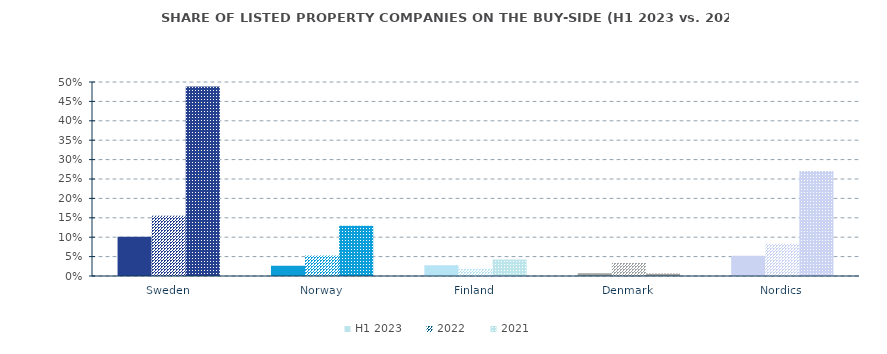
| Category | H1 2023 | 2022 | 2021 |
|---|---|---|---|
| Sweden | 0.101 | 0.156 | 0.489 |
| Norway | 0.027 | 0.053 | 0.129 |
| Finland | 0.028 | 0.018 | 0.043 |
| Denmark | 0.007 | 0.033 | 0.006 |
| Nordics | 0.052 | 0.083 | 0.27 |